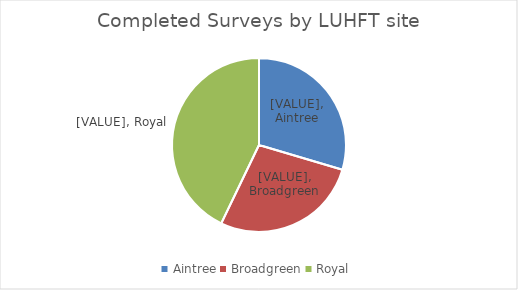
| Category | Series 0 |
|---|---|
| Aintree | 29 |
| Broadgreen | 27 |
| Royal | 42 |